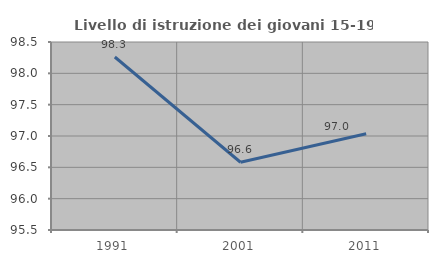
| Category | Livello di istruzione dei giovani 15-19 anni |
|---|---|
| 1991.0 | 98.261 |
| 2001.0 | 96.581 |
| 2011.0 | 97.037 |